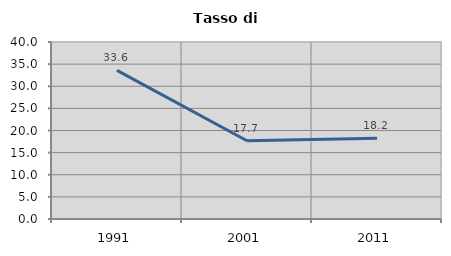
| Category | Tasso di disoccupazione   |
|---|---|
| 1991.0 | 33.599 |
| 2001.0 | 17.672 |
| 2011.0 | 18.237 |